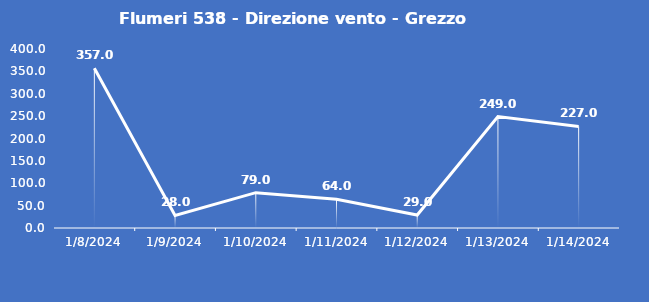
| Category | Flumeri 538 - Direzione vento - Grezzo (°N) |
|---|---|
| 1/8/24 | 357 |
| 1/9/24 | 28 |
| 1/10/24 | 79 |
| 1/11/24 | 64 |
| 1/12/24 | 29 |
| 1/13/24 | 249 |
| 1/14/24 | 227 |